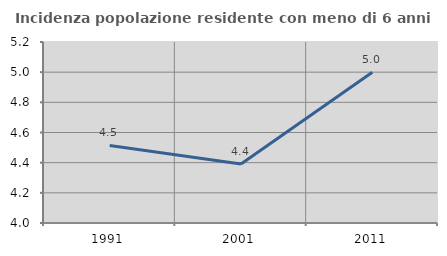
| Category | Incidenza popolazione residente con meno di 6 anni |
|---|---|
| 1991.0 | 4.514 |
| 2001.0 | 4.392 |
| 2011.0 | 5 |